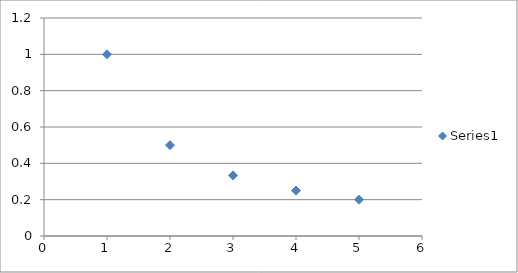
| Category | Series 0 |
|---|---|
| 1.0 | 1 |
| 2.0 | 0.5 |
| 3.0 | 0.333 |
| 4.0 | 0.25 |
| 5.0 | 0.2 |